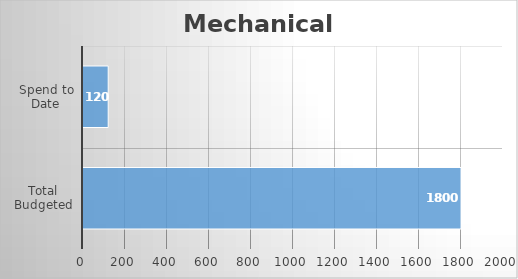
| Category | Mechanical  |
|---|---|
| Total Budgeted | 1800 |
| Spend to Date | 120 |